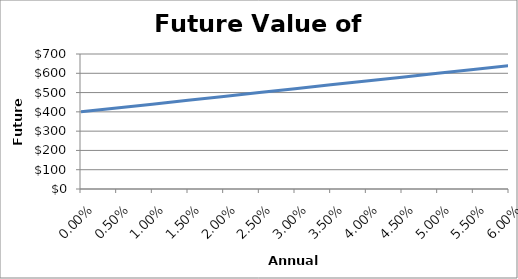
| Category | Series 0 |
|---|---|
| 0.0 | 400 |
| 0.005 | 420 |
| 0.01 | 440 |
| 0.015 | 460 |
| 0.02 | 480 |
| 0.025 | 500 |
| 0.03 | 520 |
| 0.035 | 540 |
| 0.04 | 560 |
| 0.045 | 580 |
| 0.05 | 600 |
| 0.055 | 620 |
| 0.06 | 640 |